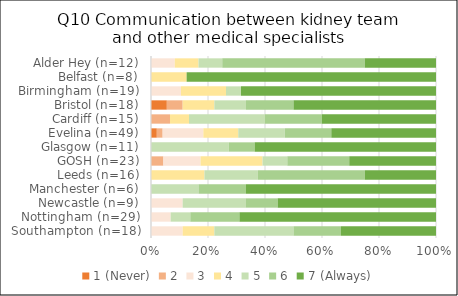
| Category | 1 (Never) | 2 | 3 | 4 | 5 | 6 | 7 (Always) |
|---|---|---|---|---|---|---|---|
| Southampton (n=18) | 0 | 0 | 2 | 2 | 5 | 3 | 6 |
| Nottingham (n=29) | 0 | 0 | 2 | 0 | 2 | 5 | 20 |
| Newcastle (n=9) | 0 | 0 | 1 | 0 | 2 | 1 | 5 |
| Manchester (n=6) | 0 | 0 | 0 | 0 | 1 | 1 | 4 |
| Leeds (n=16) | 0 | 0 | 0 | 3 | 3 | 6 | 4 |
| GOSH (n=23) | 0 | 1 | 3 | 5 | 2 | 5 | 7 |
| Glasgow (n=11) | 0 | 0 | 0 | 0 | 3 | 1 | 7 |
| Evelina (n=49) | 1 | 1 | 7 | 6 | 8 | 8 | 18 |
| Cardiff (n=15) | 0 | 1 | 0 | 1 | 4 | 3 | 6 |
| Bristol (n=18) | 1 | 1 | 0 | 2 | 2 | 3 | 9 |
| Birmingham (n=19) | 0 | 0 | 2 | 3 | 1 | 0 | 13 |
| Belfast (n=8) | 0 | 0 | 0 | 1 | 0 | 0 | 7 |
| Alder Hey (n=12) | 0 | 0 | 1 | 1 | 1 | 6 | 3 |